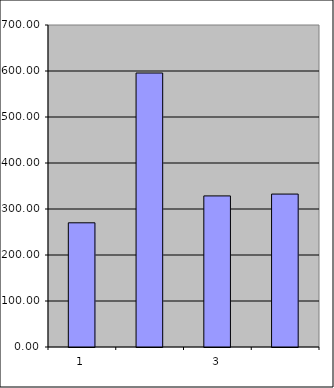
| Category | Series 0 |
|---|---|
| 0 | 270 |
| 1 | 595.639 |
| 2 | 328.46 |
| 3 | 332.457 |